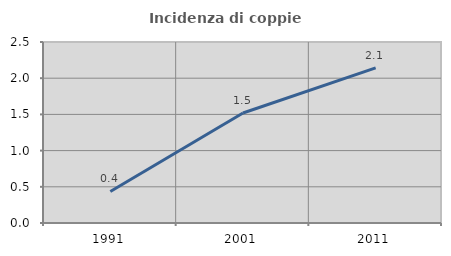
| Category | Incidenza di coppie miste |
|---|---|
| 1991.0 | 0.436 |
| 2001.0 | 1.519 |
| 2011.0 | 2.143 |